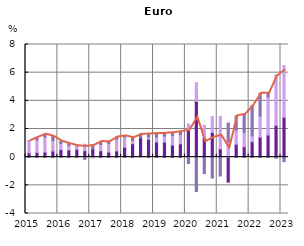
| Category | Unit labour costs | Unit profits | Unit taxes less subsidies |
|---|---|---|---|
| 2015.0 | 0.297 | 0.861 | 0 |
| nan | 0.333 | 0.892 | 0.18 |
| nan | 0.36 | 1.07 | 0.205 |
| nan | 0.433 | 0.742 | 0.302 |
| 2016.0 | 0.536 | 0.44 | 0.156 |
| nan | 0.514 | 0.306 | 0.139 |
| nan | 0.556 | 0.239 | 0.016 |
| nan | 0.458 | 0.461 | -0.156 |
| 2017.0 | 0.576 | -0.058 | 0.312 |
| nan | 0.457 | 0.44 | 0.212 |
| nan | 0.361 | 0.604 | 0.126 |
| nan | 0.44 | 0.851 | 0.143 |
| 2018.0 | 0.709 | 0.722 | 0.083 |
| nan | 0.958 | 0.221 | 0.196 |
| nan | 1.363 | -0.024 | 0.281 |
| nan | 1.279 | 0.147 | 0.223 |
| 2019.0 | 1.079 | 0.345 | 0.244 |
| nan | 1.073 | 0.428 | 0.193 |
| nan | 0.857 | 0.676 | 0.198 |
| nan | 0.947 | 0.653 | 0.218 |
| 2020.0 | 1.966 | 0.386 | -0.449 |
| nan | 3.969 | 1.312 | -2.44 |
| nan | 1.376 | 0.883 | -1.164 |
| nan | 1.752 | 1.124 | -1.477 |
| 2021.0 | 0.585 | 2.306 | -1.335 |
| nan | -1.77 | 1.102 | 1.319 |
| nan | 0.912 | 1.025 | 0.995 |
| nan | 0.742 | 1.02 | 1.28 |
| 2022.0 | 1.099 | 0.424 | 2.139 |
| nan | 1.412 | 1.499 | 1.628 |
| nan | 1.568 | 2.719 | 0.262 |
| nan | 2.251 | 3.595 | -0.08 |
| 2023.0 | 2.833 | 3.676 | -0.317 |